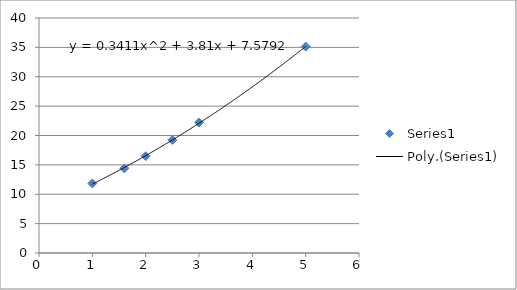
| Category | Series 0 |
|---|---|
| 1.0 | 11.843 |
| 1.6 | 14.409 |
| 2.0 | 16.481 |
| 2.5 | 19.244 |
| 3.0 | 22.205 |
| 5.0 | 35.133 |